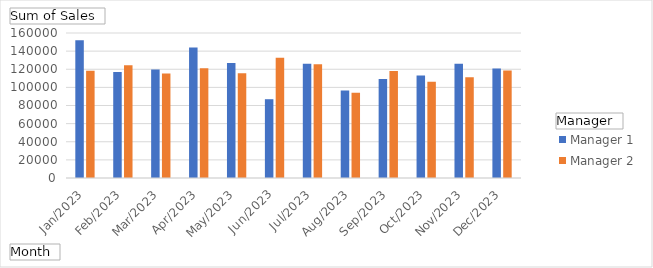
| Category | Manager 1 | Manager 2 |
|---|---|---|
| Jan/2023 | 152100.61 | 118475.19 |
| Feb/2023 | 116870.39 | 124304.61 |
| Mar/2023 | 119856.3 | 115349.85 |
| Apr/2023 | 143873.46 | 121050.27 |
| May/2023 | 127019.81 | 115452.07 |
| Jun/2023 | 86934.53 | 132602.53 |
| Jul/2023 | 126199.89 | 125506.21 |
| Aug/2023 | 96666.27 | 94196.52 |
| Sep/2023 | 109264.32 | 118007.75 |
| Oct/2023 | 113101.46 | 106125.28 |
| Nov/2023 | 125934.44 | 111080.73 |
| Dec/2023 | 120932.99 | 118621.49 |